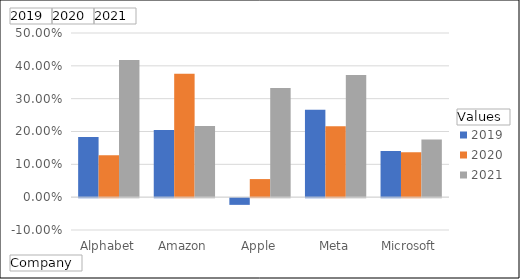
| Category | 2019 | 2020 | 2021 |
|---|---|---|---|
| Alphabet | 0.183 | 0.128 | 0.418 |
| Amazon | 0.204 | 0.376 | 0.217 |
| Apple | -0.02 | 0.055 | 0.333 |
| Meta | 0.266 | 0.216 | 0.372 |
| Microsoft | 0.14 | 0.136 | 0.175 |